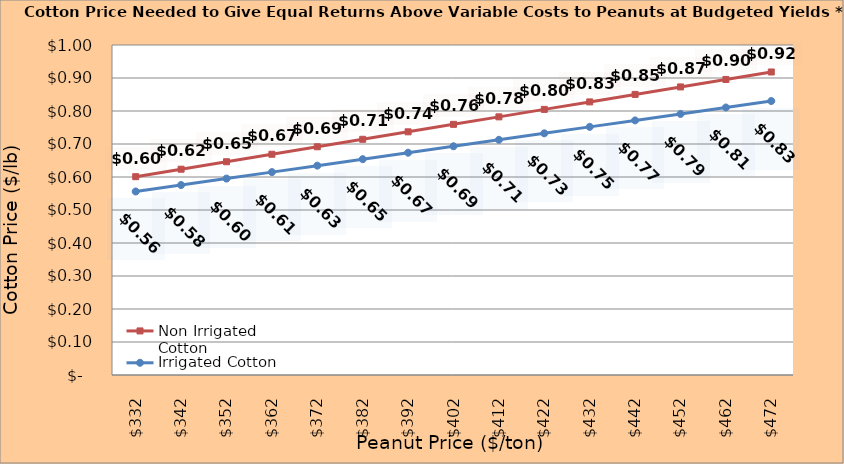
| Category | Non Irrigated Cotton | Irrigated Cotton |
|---|---|---|
| 332.02127659574467 | 0.601 | 0.556 |
| 342.02127659574467 | 0.624 | 0.576 |
| 352.02127659574467 | 0.646 | 0.595 |
| 362.02127659574467 | 0.669 | 0.615 |
| 372.02127659574467 | 0.692 | 0.634 |
| 382.02127659574467 | 0.714 | 0.654 |
| 392.02127659574467 | 0.737 | 0.674 |
| 402.02127659574467 | 0.76 | 0.693 |
| 412.02127659574467 | 0.782 | 0.713 |
| 422.02127659574467 | 0.805 | 0.732 |
| 432.02127659574467 | 0.828 | 0.752 |
| 442.02127659574467 | 0.85 | 0.771 |
| 452.02127659574467 | 0.873 | 0.791 |
| 462.02127659574467 | 0.896 | 0.811 |
| 472.02127659574467 | 0.918 | 0.83 |